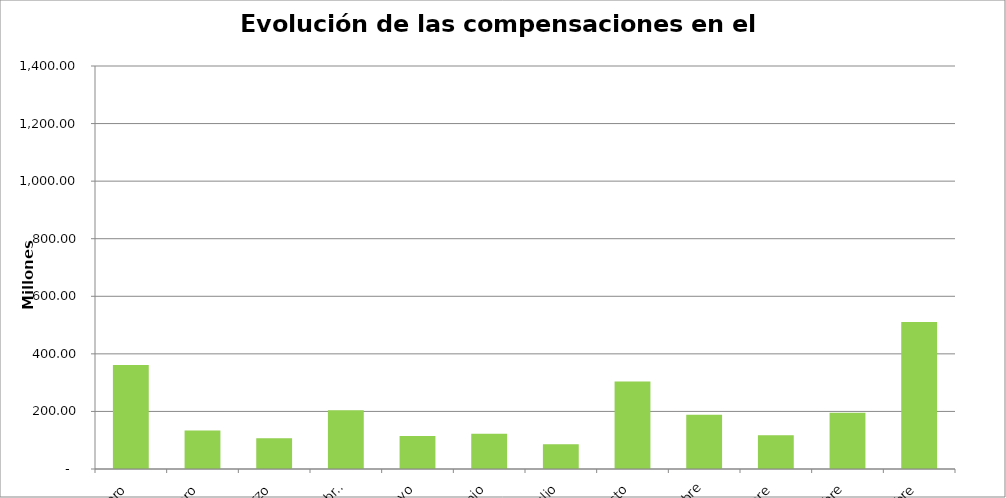
| Category | Enero |
|---|---|
| Enero | 361.324 |
| Febrero | 133.947 |
| Marzo | 107.103 |
| Abril | 203.901 |
| Mayo | 114.33 |
| Junio | 122.558 |
| Julio | 85.602 |
| Agosto | 303.789 |
| Septiembre | 188.65 |
| Octubre | 117.163 |
| Noviembre | 195.29 |
| Diciembre | 510.547 |